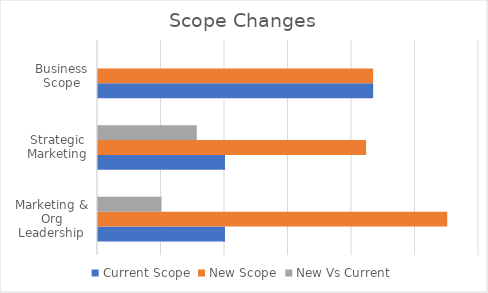
| Category | Current Scope | New Scope | New Vs Current |
|---|---|---|---|
| Marketing & Org Leadership | 1 | 2.75 | 0.5 |
| Strategic Marketing | 1 | 2.111 | 0.778 |
| Business Scope | 2.167 | 2.167 | 0 |